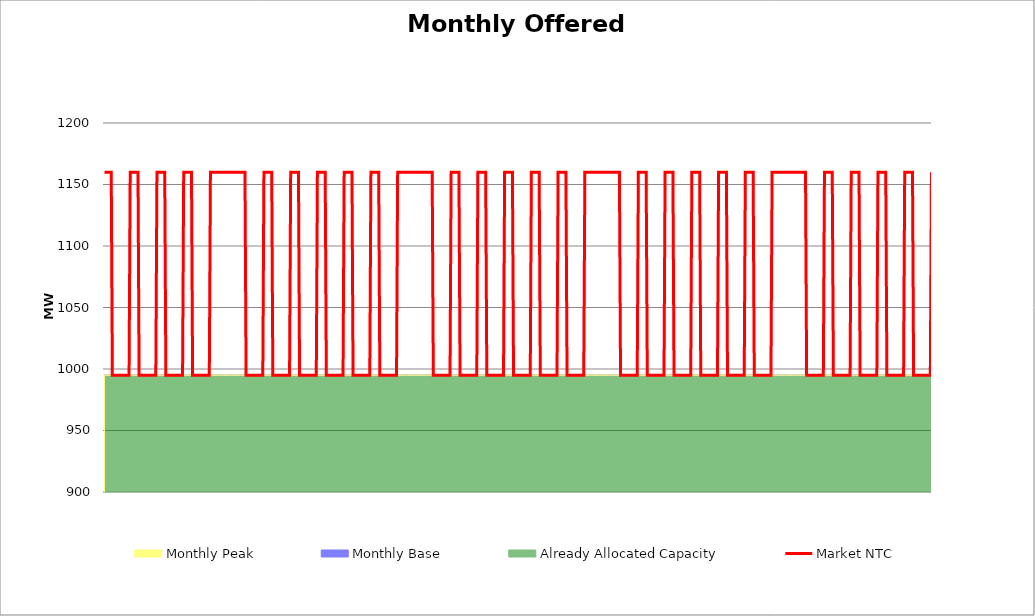
| Category | Market NTC |
|---|---|
| 0 | 1160 |
| 1 | 1160 |
| 2 | 1160 |
| 3 | 1160 |
| 4 | 1160 |
| 5 | 1160 |
| 6 | 1160 |
| 7 | 995 |
| 8 | 995 |
| 9 | 995 |
| 10 | 995 |
| 11 | 995 |
| 12 | 995 |
| 13 | 995 |
| 14 | 995 |
| 15 | 995 |
| 16 | 995 |
| 17 | 995 |
| 18 | 995 |
| 19 | 995 |
| 20 | 995 |
| 21 | 995 |
| 22 | 995 |
| 23 | 1160 |
| 24 | 1160 |
| 25 | 1160 |
| 26 | 1160 |
| 27 | 1160 |
| 28 | 1160 |
| 29 | 1160 |
| 30 | 1160 |
| 31 | 995 |
| 32 | 995 |
| 33 | 995 |
| 34 | 995 |
| 35 | 995 |
| 36 | 995 |
| 37 | 995 |
| 38 | 995 |
| 39 | 995 |
| 40 | 995 |
| 41 | 995 |
| 42 | 995 |
| 43 | 995 |
| 44 | 995 |
| 45 | 995 |
| 46 | 995 |
| 47 | 1160 |
| 48 | 1160 |
| 49 | 1160 |
| 50 | 1160 |
| 51 | 1160 |
| 52 | 1160 |
| 53 | 1160 |
| 54 | 1160 |
| 55 | 995 |
| 56 | 995 |
| 57 | 995 |
| 58 | 995 |
| 59 | 995 |
| 60 | 995 |
| 61 | 995 |
| 62 | 995 |
| 63 | 995 |
| 64 | 995 |
| 65 | 995 |
| 66 | 995 |
| 67 | 995 |
| 68 | 995 |
| 69 | 995 |
| 70 | 995 |
| 71 | 1160 |
| 72 | 1160 |
| 73 | 1160 |
| 74 | 1160 |
| 75 | 1160 |
| 76 | 1160 |
| 77 | 1160 |
| 78 | 1160 |
| 79 | 995 |
| 80 | 995 |
| 81 | 995 |
| 82 | 995 |
| 83 | 995 |
| 84 | 995 |
| 85 | 995 |
| 86 | 995 |
| 87 | 995 |
| 88 | 995 |
| 89 | 995 |
| 90 | 995 |
| 91 | 995 |
| 92 | 995 |
| 93 | 995 |
| 94 | 995 |
| 95 | 1160 |
| 96 | 1160 |
| 97 | 1160 |
| 98 | 1160 |
| 99 | 1160 |
| 100 | 1160 |
| 101 | 1160 |
| 102 | 1160 |
| 103 | 1160 |
| 104 | 1160 |
| 105 | 1160 |
| 106 | 1160 |
| 107 | 1160 |
| 108 | 1160 |
| 109 | 1160 |
| 110 | 1160 |
| 111 | 1160 |
| 112 | 1160 |
| 113 | 1160 |
| 114 | 1160 |
| 115 | 1160 |
| 116 | 1160 |
| 117 | 1160 |
| 118 | 1160 |
| 119 | 1160 |
| 120 | 1160 |
| 121 | 1160 |
| 122 | 1160 |
| 123 | 1160 |
| 124 | 1160 |
| 125 | 1160 |
| 126 | 1160 |
| 127 | 995 |
| 128 | 995 |
| 129 | 995 |
| 130 | 995 |
| 131 | 995 |
| 132 | 995 |
| 133 | 995 |
| 134 | 995 |
| 135 | 995 |
| 136 | 995 |
| 137 | 995 |
| 138 | 995 |
| 139 | 995 |
| 140 | 995 |
| 141 | 995 |
| 142 | 995 |
| 143 | 1160 |
| 144 | 1160 |
| 145 | 1160 |
| 146 | 1160 |
| 147 | 1160 |
| 148 | 1160 |
| 149 | 1160 |
| 150 | 1160 |
| 151 | 995 |
| 152 | 995 |
| 153 | 995 |
| 154 | 995 |
| 155 | 995 |
| 156 | 995 |
| 157 | 995 |
| 158 | 995 |
| 159 | 995 |
| 160 | 995 |
| 161 | 995 |
| 162 | 995 |
| 163 | 995 |
| 164 | 995 |
| 165 | 995 |
| 166 | 995 |
| 167 | 1160 |
| 168 | 1160 |
| 169 | 1160 |
| 170 | 1160 |
| 171 | 1160 |
| 172 | 1160 |
| 173 | 1160 |
| 174 | 1160 |
| 175 | 995 |
| 176 | 995 |
| 177 | 995 |
| 178 | 995 |
| 179 | 995 |
| 180 | 995 |
| 181 | 995 |
| 182 | 995 |
| 183 | 995 |
| 184 | 995 |
| 185 | 995 |
| 186 | 995 |
| 187 | 995 |
| 188 | 995 |
| 189 | 995 |
| 190 | 995 |
| 191 | 1160 |
| 192 | 1160 |
| 193 | 1160 |
| 194 | 1160 |
| 195 | 1160 |
| 196 | 1160 |
| 197 | 1160 |
| 198 | 1160 |
| 199 | 995 |
| 200 | 995 |
| 201 | 995 |
| 202 | 995 |
| 203 | 995 |
| 204 | 995 |
| 205 | 995 |
| 206 | 995 |
| 207 | 995 |
| 208 | 995 |
| 209 | 995 |
| 210 | 995 |
| 211 | 995 |
| 212 | 995 |
| 213 | 995 |
| 214 | 995 |
| 215 | 1160 |
| 216 | 1160 |
| 217 | 1160 |
| 218 | 1160 |
| 219 | 1160 |
| 220 | 1160 |
| 221 | 1160 |
| 222 | 1160 |
| 223 | 995 |
| 224 | 995 |
| 225 | 995 |
| 226 | 995 |
| 227 | 995 |
| 228 | 995 |
| 229 | 995 |
| 230 | 995 |
| 231 | 995 |
| 232 | 995 |
| 233 | 995 |
| 234 | 995 |
| 235 | 995 |
| 236 | 995 |
| 237 | 995 |
| 238 | 995 |
| 239 | 1160 |
| 240 | 1160 |
| 241 | 1160 |
| 242 | 1160 |
| 243 | 1160 |
| 244 | 1160 |
| 245 | 1160 |
| 246 | 1160 |
| 247 | 995 |
| 248 | 995 |
| 249 | 995 |
| 250 | 995 |
| 251 | 995 |
| 252 | 995 |
| 253 | 995 |
| 254 | 995 |
| 255 | 995 |
| 256 | 995 |
| 257 | 995 |
| 258 | 995 |
| 259 | 995 |
| 260 | 995 |
| 261 | 995 |
| 262 | 995 |
| 263 | 1160 |
| 264 | 1160 |
| 265 | 1160 |
| 266 | 1160 |
| 267 | 1160 |
| 268 | 1160 |
| 269 | 1160 |
| 270 | 1160 |
| 271 | 1160 |
| 272 | 1160 |
| 273 | 1160 |
| 274 | 1160 |
| 275 | 1160 |
| 276 | 1160 |
| 277 | 1160 |
| 278 | 1160 |
| 279 | 1160 |
| 280 | 1160 |
| 281 | 1160 |
| 282 | 1160 |
| 283 | 1160 |
| 284 | 1160 |
| 285 | 1160 |
| 286 | 1160 |
| 287 | 1160 |
| 288 | 1160 |
| 289 | 1160 |
| 290 | 1160 |
| 291 | 1160 |
| 292 | 1160 |
| 293 | 1160 |
| 294 | 1160 |
| 295 | 995 |
| 296 | 995 |
| 297 | 995 |
| 298 | 995 |
| 299 | 995 |
| 300 | 995 |
| 301 | 995 |
| 302 | 995 |
| 303 | 995 |
| 304 | 995 |
| 305 | 995 |
| 306 | 995 |
| 307 | 995 |
| 308 | 995 |
| 309 | 995 |
| 310 | 995 |
| 311 | 1160 |
| 312 | 1160 |
| 313 | 1160 |
| 314 | 1160 |
| 315 | 1160 |
| 316 | 1160 |
| 317 | 1160 |
| 318 | 1160 |
| 319 | 995 |
| 320 | 995 |
| 321 | 995 |
| 322 | 995 |
| 323 | 995 |
| 324 | 995 |
| 325 | 995 |
| 326 | 995 |
| 327 | 995 |
| 328 | 995 |
| 329 | 995 |
| 330 | 995 |
| 331 | 995 |
| 332 | 995 |
| 333 | 995 |
| 334 | 995 |
| 335 | 1160 |
| 336 | 1160 |
| 337 | 1160 |
| 338 | 1160 |
| 339 | 1160 |
| 340 | 1160 |
| 341 | 1160 |
| 342 | 1160 |
| 343 | 995 |
| 344 | 995 |
| 345 | 995 |
| 346 | 995 |
| 347 | 995 |
| 348 | 995 |
| 349 | 995 |
| 350 | 995 |
| 351 | 995 |
| 352 | 995 |
| 353 | 995 |
| 354 | 995 |
| 355 | 995 |
| 356 | 995 |
| 357 | 995 |
| 358 | 995 |
| 359 | 1160 |
| 360 | 1160 |
| 361 | 1160 |
| 362 | 1160 |
| 363 | 1160 |
| 364 | 1160 |
| 365 | 1160 |
| 366 | 1160 |
| 367 | 995 |
| 368 | 995 |
| 369 | 995 |
| 370 | 995 |
| 371 | 995 |
| 372 | 995 |
| 373 | 995 |
| 374 | 995 |
| 375 | 995 |
| 376 | 995 |
| 377 | 995 |
| 378 | 995 |
| 379 | 995 |
| 380 | 995 |
| 381 | 995 |
| 382 | 995 |
| 383 | 1160 |
| 384 | 1160 |
| 385 | 1160 |
| 386 | 1160 |
| 387 | 1160 |
| 388 | 1160 |
| 389 | 1160 |
| 390 | 1160 |
| 391 | 995 |
| 392 | 995 |
| 393 | 995 |
| 394 | 995 |
| 395 | 995 |
| 396 | 995 |
| 397 | 995 |
| 398 | 995 |
| 399 | 995 |
| 400 | 995 |
| 401 | 995 |
| 402 | 995 |
| 403 | 995 |
| 404 | 995 |
| 405 | 995 |
| 406 | 995 |
| 407 | 1160 |
| 408 | 1160 |
| 409 | 1160 |
| 410 | 1160 |
| 411 | 1160 |
| 412 | 1160 |
| 413 | 1160 |
| 414 | 1160 |
| 415 | 995 |
| 416 | 995 |
| 417 | 995 |
| 418 | 995 |
| 419 | 995 |
| 420 | 995 |
| 421 | 995 |
| 422 | 995 |
| 423 | 995 |
| 424 | 995 |
| 425 | 995 |
| 426 | 995 |
| 427 | 995 |
| 428 | 995 |
| 429 | 995 |
| 430 | 995 |
| 431 | 1160 |
| 432 | 1160 |
| 433 | 1160 |
| 434 | 1160 |
| 435 | 1160 |
| 436 | 1160 |
| 437 | 1160 |
| 438 | 1160 |
| 439 | 1160 |
| 440 | 1160 |
| 441 | 1160 |
| 442 | 1160 |
| 443 | 1160 |
| 444 | 1160 |
| 445 | 1160 |
| 446 | 1160 |
| 447 | 1160 |
| 448 | 1160 |
| 449 | 1160 |
| 450 | 1160 |
| 451 | 1160 |
| 452 | 1160 |
| 453 | 1160 |
| 454 | 1160 |
| 455 | 1160 |
| 456 | 1160 |
| 457 | 1160 |
| 458 | 1160 |
| 459 | 1160 |
| 460 | 1160 |
| 461 | 1160 |
| 462 | 1160 |
| 463 | 995 |
| 464 | 995 |
| 465 | 995 |
| 466 | 995 |
| 467 | 995 |
| 468 | 995 |
| 469 | 995 |
| 470 | 995 |
| 471 | 995 |
| 472 | 995 |
| 473 | 995 |
| 474 | 995 |
| 475 | 995 |
| 476 | 995 |
| 477 | 995 |
| 478 | 995 |
| 479 | 1160 |
| 480 | 1160 |
| 481 | 1160 |
| 482 | 1160 |
| 483 | 1160 |
| 484 | 1160 |
| 485 | 1160 |
| 486 | 1160 |
| 487 | 995 |
| 488 | 995 |
| 489 | 995 |
| 490 | 995 |
| 491 | 995 |
| 492 | 995 |
| 493 | 995 |
| 494 | 995 |
| 495 | 995 |
| 496 | 995 |
| 497 | 995 |
| 498 | 995 |
| 499 | 995 |
| 500 | 995 |
| 501 | 995 |
| 502 | 995 |
| 503 | 1160 |
| 504 | 1160 |
| 505 | 1160 |
| 506 | 1160 |
| 507 | 1160 |
| 508 | 1160 |
| 509 | 1160 |
| 510 | 1160 |
| 511 | 995 |
| 512 | 995 |
| 513 | 995 |
| 514 | 995 |
| 515 | 995 |
| 516 | 995 |
| 517 | 995 |
| 518 | 995 |
| 519 | 995 |
| 520 | 995 |
| 521 | 995 |
| 522 | 995 |
| 523 | 995 |
| 524 | 995 |
| 525 | 995 |
| 526 | 995 |
| 527 | 1160 |
| 528 | 1160 |
| 529 | 1160 |
| 530 | 1160 |
| 531 | 1160 |
| 532 | 1160 |
| 533 | 1160 |
| 534 | 1160 |
| 535 | 995 |
| 536 | 995 |
| 537 | 995 |
| 538 | 995 |
| 539 | 995 |
| 540 | 995 |
| 541 | 995 |
| 542 | 995 |
| 543 | 995 |
| 544 | 995 |
| 545 | 995 |
| 546 | 995 |
| 547 | 995 |
| 548 | 995 |
| 549 | 995 |
| 550 | 995 |
| 551 | 1160 |
| 552 | 1160 |
| 553 | 1160 |
| 554 | 1160 |
| 555 | 1160 |
| 556 | 1160 |
| 557 | 1160 |
| 558 | 1160 |
| 559 | 995 |
| 560 | 995 |
| 561 | 995 |
| 562 | 995 |
| 563 | 995 |
| 564 | 995 |
| 565 | 995 |
| 566 | 995 |
| 567 | 995 |
| 568 | 995 |
| 569 | 995 |
| 570 | 995 |
| 571 | 995 |
| 572 | 995 |
| 573 | 995 |
| 574 | 995 |
| 575 | 1160 |
| 576 | 1160 |
| 577 | 1160 |
| 578 | 1160 |
| 579 | 1160 |
| 580 | 1160 |
| 581 | 1160 |
| 582 | 1160 |
| 583 | 995 |
| 584 | 995 |
| 585 | 995 |
| 586 | 995 |
| 587 | 995 |
| 588 | 995 |
| 589 | 995 |
| 590 | 995 |
| 591 | 995 |
| 592 | 995 |
| 593 | 995 |
| 594 | 995 |
| 595 | 995 |
| 596 | 995 |
| 597 | 995 |
| 598 | 995 |
| 599 | 1160 |
| 600 | 1160 |
| 601 | 1160 |
| 602 | 1160 |
| 603 | 1160 |
| 604 | 1160 |
| 605 | 1160 |
| 606 | 1160 |
| 607 | 1160 |
| 608 | 1160 |
| 609 | 1160 |
| 610 | 1160 |
| 611 | 1160 |
| 612 | 1160 |
| 613 | 1160 |
| 614 | 1160 |
| 615 | 1160 |
| 616 | 1160 |
| 617 | 1160 |
| 618 | 1160 |
| 619 | 1160 |
| 620 | 1160 |
| 621 | 1160 |
| 622 | 1160 |
| 623 | 1160 |
| 624 | 1160 |
| 625 | 1160 |
| 626 | 1160 |
| 627 | 1160 |
| 628 | 1160 |
| 629 | 1160 |
| 630 | 995 |
| 631 | 995 |
| 632 | 995 |
| 633 | 995 |
| 634 | 995 |
| 635 | 995 |
| 636 | 995 |
| 637 | 995 |
| 638 | 995 |
| 639 | 995 |
| 640 | 995 |
| 641 | 995 |
| 642 | 995 |
| 643 | 995 |
| 644 | 995 |
| 645 | 995 |
| 646 | 1160 |
| 647 | 1160 |
| 648 | 1160 |
| 649 | 1160 |
| 650 | 1160 |
| 651 | 1160 |
| 652 | 1160 |
| 653 | 1160 |
| 654 | 995 |
| 655 | 995 |
| 656 | 995 |
| 657 | 995 |
| 658 | 995 |
| 659 | 995 |
| 660 | 995 |
| 661 | 995 |
| 662 | 995 |
| 663 | 995 |
| 664 | 995 |
| 665 | 995 |
| 666 | 995 |
| 667 | 995 |
| 668 | 995 |
| 669 | 995 |
| 670 | 1160 |
| 671 | 1160 |
| 672 | 1160 |
| 673 | 1160 |
| 674 | 1160 |
| 675 | 1160 |
| 676 | 1160 |
| 677 | 1160 |
| 678 | 995 |
| 679 | 995 |
| 680 | 995 |
| 681 | 995 |
| 682 | 995 |
| 683 | 995 |
| 684 | 995 |
| 685 | 995 |
| 686 | 995 |
| 687 | 995 |
| 688 | 995 |
| 689 | 995 |
| 690 | 995 |
| 691 | 995 |
| 692 | 995 |
| 693 | 995 |
| 694 | 1160 |
| 695 | 1160 |
| 696 | 1160 |
| 697 | 1160 |
| 698 | 1160 |
| 699 | 1160 |
| 700 | 1160 |
| 701 | 1160 |
| 702 | 995 |
| 703 | 995 |
| 704 | 995 |
| 705 | 995 |
| 706 | 995 |
| 707 | 995 |
| 708 | 995 |
| 709 | 995 |
| 710 | 995 |
| 711 | 995 |
| 712 | 995 |
| 713 | 995 |
| 714 | 995 |
| 715 | 995 |
| 716 | 995 |
| 717 | 995 |
| 718 | 1160 |
| 719 | 1160 |
| 720 | 1160 |
| 721 | 1160 |
| 722 | 1160 |
| 723 | 1160 |
| 724 | 1160 |
| 725 | 1160 |
| 726 | 995 |
| 727 | 995 |
| 728 | 995 |
| 729 | 995 |
| 730 | 995 |
| 731 | 995 |
| 732 | 995 |
| 733 | 995 |
| 734 | 995 |
| 735 | 995 |
| 736 | 995 |
| 737 | 995 |
| 738 | 995 |
| 739 | 995 |
| 740 | 995 |
| 741 | 995 |
| 742 | 1160 |